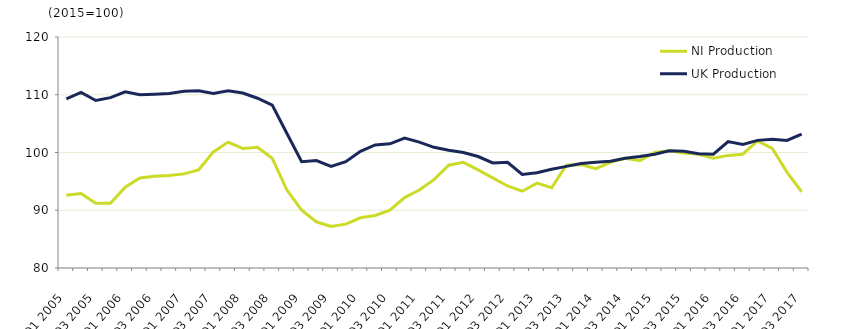
| Category | NI Production | UK Production |
|---|---|---|
| Q1 2005 | 92.6 | 109.3 |
|  | 92.9 | 110.4 |
| Q3 2005 | 91.2 | 109 |
|  | 91.2 | 109.5 |
| Q1 2006 | 94 | 110.5 |
|  | 95.6 | 110 |
| Q3 2006 | 95.9 | 110.1 |
|  | 96 | 110.2 |
| Q1 2007 | 96.3 | 110.6 |
|  | 97 | 110.7 |
| Q3 2007 | 100.1 | 110.2 |
|  | 101.8 | 110.7 |
| Q1 2008 | 100.7 | 110.3 |
|  | 100.9 | 109.4 |
| Q3 2008 | 99 | 108.2 |
|  | 93.5 | 103.3 |
| Q1 2009 | 90 | 98.4 |
|  | 88 | 98.6 |
| Q3 2009 | 87.2 | 97.6 |
|  | 87.6 | 98.4 |
| Q1 2010 | 88.7 | 100.2 |
|  | 89.1 | 101.3 |
| Q3 2010 | 90 | 101.5 |
|  | 92.2 | 102.5 |
| Q1 2011 | 93.5 | 101.8 |
|  | 95.3 | 100.9 |
| Q3 2011 | 97.8 | 100.4 |
|  | 98.3 | 100 |
| Q1 2012 | 97 | 99.3 |
|  | 95.6 | 98.2 |
| Q3 2012 | 94.2 | 98.3 |
|  | 93.3 | 96.2 |
| Q1 2013 | 94.7 | 96.5 |
|  | 93.9 | 97.1 |
| Q3 2013 | 97.8 | 97.6 |
|  | 97.9 | 98.1 |
| Q1 2014 | 97.2 | 98.3 |
|  | 98.3 | 98.5 |
| Q3 2014 | 99 | 99 |
|  | 98.6 | 99.3 |
| Q1 2015 | 100 | 99.7 |
|  | 100.3 | 100.3 |
| Q3 2015 | 99.9 | 100.2 |
|  | 99.7 | 99.8 |
| Q1 2016 | 99 | 99.7 |
|  | 99.5 | 101.9 |
| Q3 2016 | 99.7 | 101.4 |
|  | 102 | 102.1 |
| Q1 2017 | 100.7 | 102.3 |
|  | 96.6 | 102.1 |
| Q3 2017 | 93.2 | 103.2 |